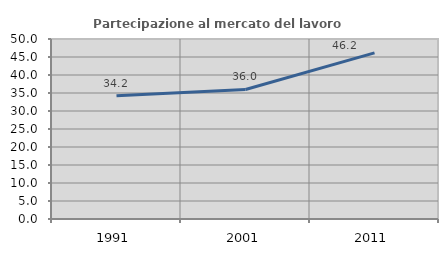
| Category | Partecipazione al mercato del lavoro  femminile |
|---|---|
| 1991.0 | 34.231 |
| 2001.0 | 35.986 |
| 2011.0 | 46.154 |